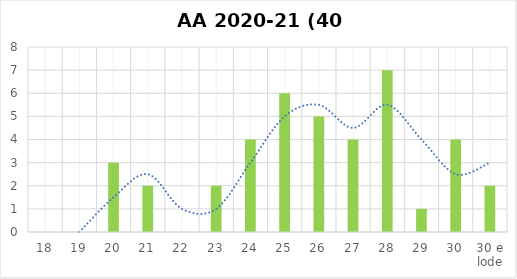
| Category | Series 0 |
|---|---|
| 18 | 0 |
| 19 | 0 |
| 20 | 3 |
| 21 | 2 |
| 22 | 0 |
| 23 | 2 |
| 24 | 4 |
| 25 | 6 |
| 26 | 5 |
| 27 | 4 |
| 28 | 7 |
| 29 | 1 |
| 30 | 4 |
| 30 e lode | 2 |